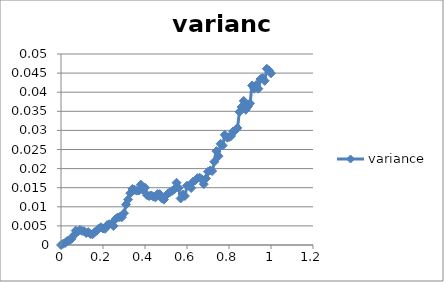
| Category | variance |
|---|---|
| 0.0 | 0 |
| 0.01 | 0 |
| 0.02 | 0.001 |
| 0.03 | 0.001 |
| 0.04 | 0.001 |
| 0.05 | 0.002 |
| 0.06 | 0.002 |
| 0.07 | 0.004 |
| 0.08 | 0.004 |
| 0.09 | 0.004 |
| 0.1 | 0.004 |
| 0.11 | 0.004 |
| 0.12 | 0.003 |
| 0.13 | 0.003 |
| 0.14 | 0.003 |
| 0.15 | 0.003 |
| 0.16 | 0.003 |
| 0.17 | 0.004 |
| 0.18 | 0.004 |
| 0.19 | 0.005 |
| 0.2 | 0.004 |
| 0.21 | 0.004 |
| 0.22 | 0.005 |
| 0.23 | 0.005 |
| 0.24 | 0.005 |
| 0.25 | 0.005 |
| 0.26 | 0.007 |
| 0.27 | 0.007 |
| 0.28 | 0.007 |
| 0.29 | 0.007 |
| 0.3 | 0.008 |
| 0.31 | 0.011 |
| 0.32 | 0.012 |
| 0.33 | 0.014 |
| 0.34 | 0.015 |
| 0.35 | 0.014 |
| 0.36 | 0.014 |
| 0.37 | 0.014 |
| 0.38 | 0.016 |
| 0.39 | 0.014 |
| 0.4 | 0.015 |
| 0.41 | 0.013 |
| 0.42 | 0.013 |
| 0.43 | 0.013 |
| 0.44 | 0.013 |
| 0.45 | 0.012 |
| 0.46 | 0.013 |
| 0.47 | 0.013 |
| 0.48 | 0.012 |
| 0.49 | 0.012 |
| 0.5 | 0.013 |
| 0.51 | 0.014 |
| 0.52 | 0.014 |
| 0.53 | 0.014 |
| 0.54 | 0.015 |
| 0.55 | 0.016 |
| 0.56 | 0.015 |
| 0.57 | 0.012 |
| 0.58 | 0.013 |
| 0.59 | 0.013 |
| 0.6 | 0.016 |
| 0.61 | 0.015 |
| 0.62 | 0.015 |
| 0.63 | 0.017 |
| 0.64 | 0.017 |
| 0.65 | 0.017 |
| 0.66 | 0.018 |
| 0.67 | 0.017 |
| 0.68 | 0.016 |
| 0.69 | 0.017 |
| 0.7 | 0.019 |
| 0.71 | 0.02 |
| 0.72 | 0.019 |
| 0.73 | 0.022 |
| 0.74 | 0.025 |
| 0.75 | 0.023 |
| 0.76 | 0.027 |
| 0.77 | 0.026 |
| 0.78 | 0.029 |
| 0.79 | 0.028 |
| 0.8 | 0.028 |
| 0.81 | 0.029 |
| 0.82 | 0.03 |
| 0.83 | 0.03 |
| 0.84 | 0.031 |
| 0.85 | 0.035 |
| 0.86 | 0.036 |
| 0.87 | 0.038 |
| 0.88 | 0.035 |
| 0.89 | 0.036 |
| 0.9 | 0.037 |
| 0.91 | 0.042 |
| 0.92 | 0.041 |
| 0.93 | 0.042 |
| 0.94 | 0.041 |
| 0.95 | 0.043 |
| 0.96 | 0.044 |
| 0.97 | 0.043 |
| 0.98 | 0.046 |
| 0.99 | 0.046 |
| 1.0 | 0.045 |